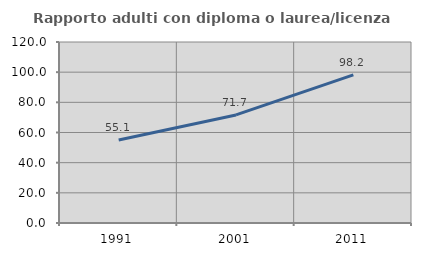
| Category | Rapporto adulti con diploma o laurea/licenza media  |
|---|---|
| 1991.0 | 55.063 |
| 2001.0 | 71.658 |
| 2011.0 | 98.154 |